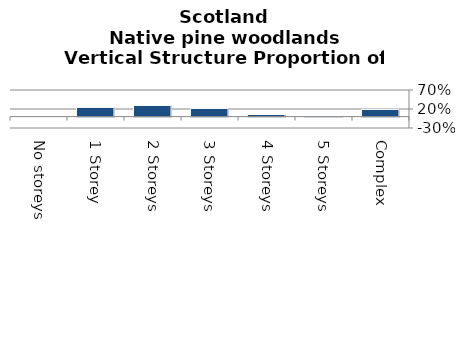
| Category | Native pine woodlands |
|---|---|
| No storeys | 0 |
| 1 Storey | 0.242 |
| 2 Storeys | 0.294 |
| 3 Storeys | 0.215 |
| 4 Storeys | 0.055 |
| 5 Storeys | 0.004 |
| Complex | 0.189 |